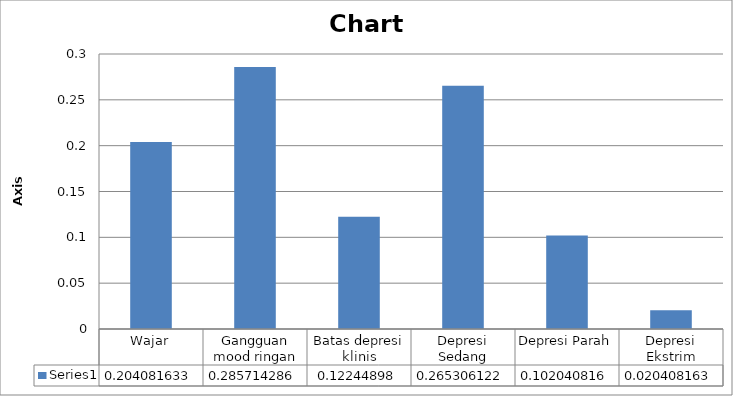
| Category | Series 0 |
|---|---|
| Wajar | 0.204 |
| Gangguan mood ringan | 0.286 |
| Batas depresi klinis | 0.122 |
| Depresi Sedang | 0.265 |
| Depresi Parah | 0.102 |
| Depresi Ekstrim | 0.02 |